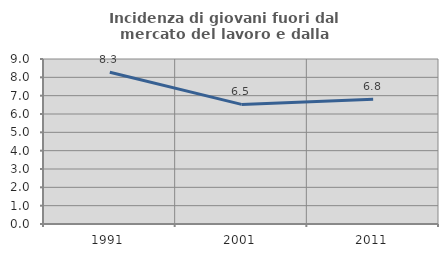
| Category | Incidenza di giovani fuori dal mercato del lavoro e dalla formazione  |
|---|---|
| 1991.0 | 8.274 |
| 2001.0 | 6.524 |
| 2011.0 | 6.804 |